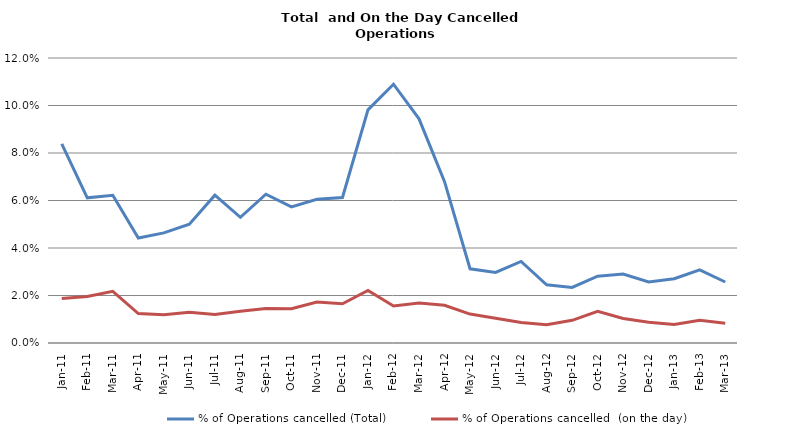
| Category | % of Operations cancelled (Total) | % of Operations cancelled  (on the day) |
|---|---|---|
| Jan-11 | 0.084 | 0.019 |
| Feb-11 | 0.061 | 0.02 |
| Mar-11 | 0.062 | 0.022 |
| Apr-11 | 0.044 | 0.012 |
| May-11 | 0.046 | 0.012 |
| Jun-11 | 0.05 | 0.013 |
| Jul-11 | 0.062 | 0.012 |
| Aug-11 | 0.053 | 0.013 |
| Sep-11 | 0.063 | 0.015 |
| Oct-11 | 0.057 | 0.014 |
| Nov-11 | 0.061 | 0.017 |
| Dec-11 | 0.061 | 0.016 |
| Jan-12 | 0.098 | 0.022 |
| Feb-12 | 0.109 | 0.016 |
| Mar-12 | 0.094 | 0.017 |
| Apr-12 | 0.068 | 0.016 |
| May-12 | 0.031 | 0.012 |
| Jun-12 | 0.03 | 0.01 |
| Jul-12 | 0.034 | 0.009 |
| Aug-12 | 0.025 | 0.008 |
| Sep-12 | 0.023 | 0.01 |
| Oct-12 | 0.028 | 0.013 |
| Nov-12 | 0.029 | 0.01 |
| Dec-12 | 0.026 | 0.009 |
| Jan-13 | 0.027 | 0.008 |
| Feb-13 | 0.031 | 0.01 |
| Mar-13 | 0.026 | 0.008 |